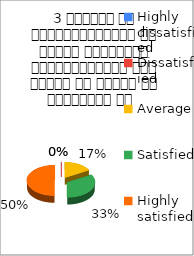
| Category | 3 शिक्षक का विद्यार्थियों के प्रति व्यव्हार मित्रतापूर्ण एवं सहयोग के भावना से परिपूर्ण था   |
|---|---|
| Highly dissatisfied | 0 |
| Dissatisfied | 0 |
| Average | 1 |
| Satisfied | 2 |
| Highly satisfied | 3 |